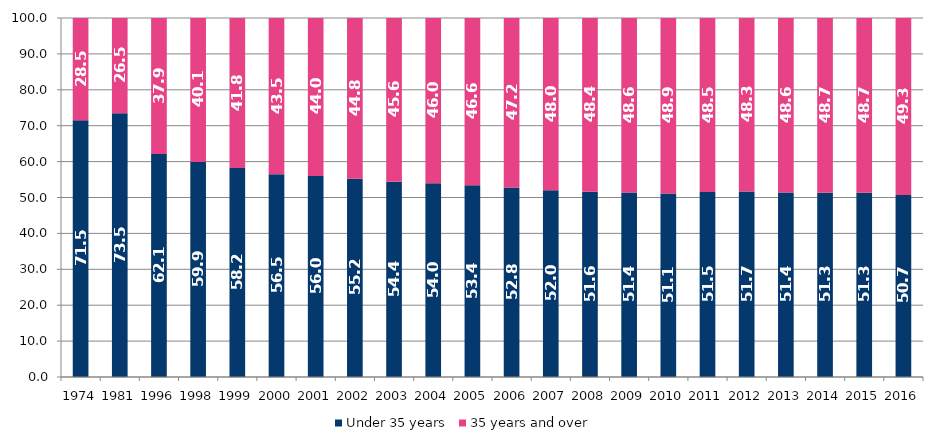
| Category | Under 35 years | 35 years and over |
|---|---|---|
| 1974.0 | 71.5 | 28.5 |
| 1981.0 | 73.5 | 26.5 |
| 1996.0 | 62.1 | 37.9 |
| 1998.0 | 59.9 | 40.1 |
| 1999.0 | 58.2 | 41.8 |
| 2000.0 | 56.5 | 43.5 |
| 2001.0 | 56 | 44 |
| 2002.0 | 55.2 | 44.8 |
| 2003.0 | 54.4 | 45.6 |
| 2004.0 | 54 | 46 |
| 2005.0 | 53.4 | 46.6 |
| 2006.0 | 52.8 | 47.2 |
| 2007.0 | 52 | 48 |
| 2008.0 | 51.6 | 48.4 |
| 2009.0 | 51.4 | 48.6 |
| 2010.0 | 51.1 | 48.9 |
| 2011.0 | 51.5 | 48.5 |
| 2012.0 | 51.7 | 48.3 |
| 2013.0 | 51.4 | 48.6 |
| 2014.0 | 51.3 | 48.7 |
| 2015.0 | 51.3 | 48.7 |
| 2016.0 | 50.7 | 49.3 |